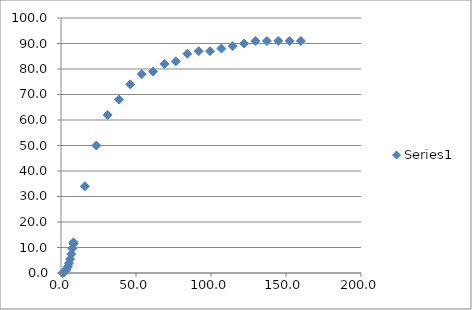
| Category | Series 0 |
|---|---|
| 1.0616113744075837 | 0 |
| 1.5165876777251188 | 0.14 |
| 2.274881516587678 | 0.45 |
| 3.0331753554502376 | 0.91 |
| 3.783886255924171 | 1.59 |
| 4.549763033175356 | 2.55 |
| 5.308056872037915 | 3.83 |
| 6.066350710900474 | 5.47 |
| 6.8246445497630335 | 7.44 |
| 7.582938388625592 | 9.61 |
| 8.341232227488153 | 12.04 |
| 8.341232227488153 | 11.44 |
| 15.924170616113745 | 34 |
| 23.582938388625593 | 50 |
| 31.090047393364927 | 62 |
| 38.67298578199052 | 68 |
| 46.18009478672985 | 74 |
| 53.838862559241704 | 78 |
| 61.34597156398104 | 79 |
| 69.00473933649289 | 82 |
| 76.58767772511848 | 83 |
| 84.24644549763032 | 86 |
| 91.82938388625593 | 87 |
| 99.33649289099526 | 87 |
| 106.91943127962084 | 88 |
| 114.50236966824644 | 89 |
| 122.08530805687204 | 90 |
| 129.66824644549763 | 91 |
| 137.25118483412322 | 91 |
| 144.83412322274881 | 91 |
| 152.4170616113744 | 91 |
| 159.92417061611374 | 91 |